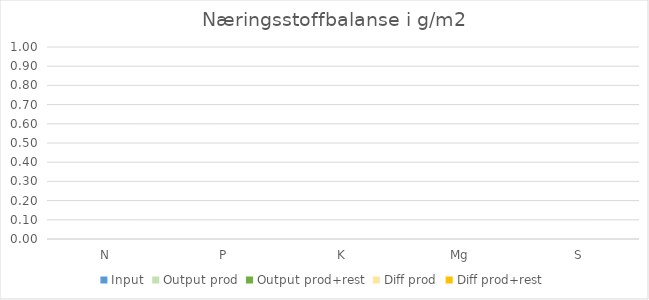
| Category | Input | Output prod | Output prod+rest | Diff prod | Diff prod+rest |
|---|---|---|---|---|---|
| N | 0 | 0 | 0 | 0 | 0 |
| P | 0 | 0 | 0 | 0 | 0 |
| K | 0 | 0 | 0 | 0 | 0 |
| Mg | 0 | 0 | 0 | 0 | 0 |
| S | 0 | 0 | 0 | 0 | 0 |